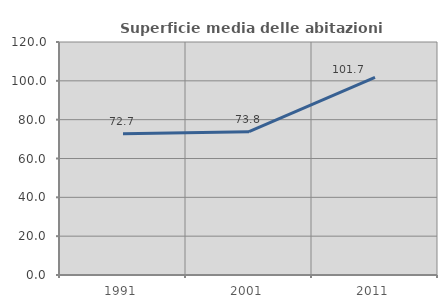
| Category | Superficie media delle abitazioni occupate |
|---|---|
| 1991.0 | 72.707 |
| 2001.0 | 73.789 |
| 2011.0 | 101.741 |